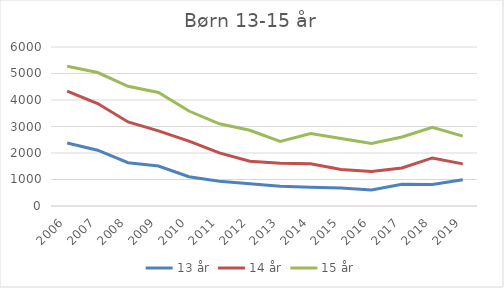
| Category | 13 år | 14 år | 15 år |
|---|---|---|---|
| 2006.0 | 2380 | 4338 | 5271 |
| 2007.0 | 2106 | 3865 | 5036 |
| 2008.0 | 1635 | 3173 | 4518 |
| 2009.0 | 1509 | 2836 | 4286 |
| 2010.0 | 1107 | 2450 | 3584 |
| 2011.0 | 934 | 2002 | 3102 |
| 2012.0 | 844 | 1690 | 2857 |
| 2013.0 | 741 | 1615 | 2438 |
| 2014.0 | 709 | 1595 | 2737 |
| 2015.0 | 676 | 1379 | 2548 |
| 2016.0 | 606 | 1298 | 2357 |
| 2017.0 | 817 | 1437 | 2606 |
| 2018.0 | 814 | 1814 | 2971 |
| 2019.0 | 994 | 1589 | 2636 |